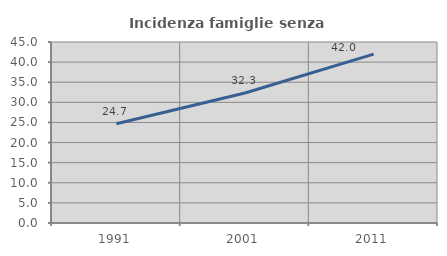
| Category | Incidenza famiglie senza nuclei |
|---|---|
| 1991.0 | 24.691 |
| 2001.0 | 32.33 |
| 2011.0 | 41.991 |